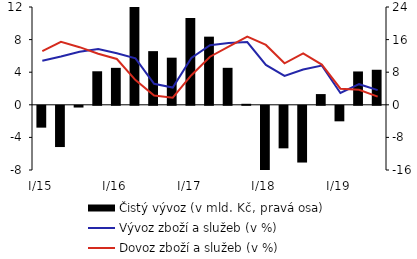
| Category | Čistý vývoz (v mld. Kč, pravá osa) |
|---|---|
| I/15 | -5.361 |
| II | -10.121 |
| III | -0.427 |
| IV | 8.227 |
| I/16 | 9.069 |
| II | 24.031 |
| III | 13.168 |
| IV | 11.567 |
| I/17 | 21.305 |
| II | 16.723 |
| III | 9.075 |
| IV | 0.245 |
| I/18 | -16.778 |
| II | -10.439 |
| III | -13.924 |
| IV | 2.631 |
| I/19 | -3.811 |
| II | 8.182 |
| III | 8.6 |